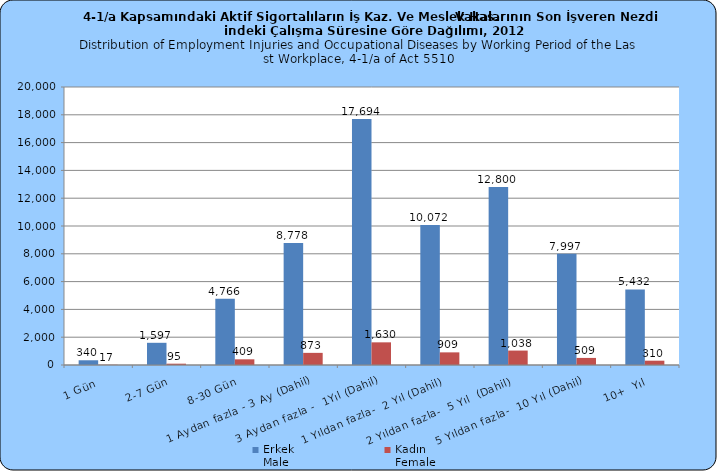
| Category | Erkek
Male | Kadın
Female |
|---|---|---|
|   1 Gün | 340 | 17 |
|   2-7 Gün | 1597 | 95 |
|   8-30 Gün | 4766 | 409 |
| 1 Aydan fazla - 3 Ay (Dahil) | 8778 | 873 |
| 3 Aydan fazla -  1Yıl (Dahil) | 17694 | 1630 |
| 1 Yıldan fazla-  2 Yıl (Dahil) | 10072 | 909 |
| 2 Yıldan fazla-  5 Yıl  (Dahil) | 12800 | 1038 |
| 5 Yıldan fazla-  10 Yıl (Dahil) | 7997 | 509 |
| 10+  Yıl | 5432 | 310 |